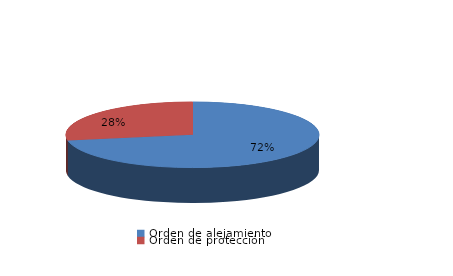
| Category | Series 0 |
|---|---|
| Orden de alejamiento | 78 |
| Orden de protección | 30 |